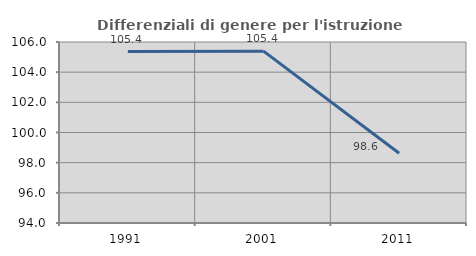
| Category | Differenziali di genere per l'istruzione superiore |
|---|---|
| 1991.0 | 105.364 |
| 2001.0 | 105.395 |
| 2011.0 | 98.622 |